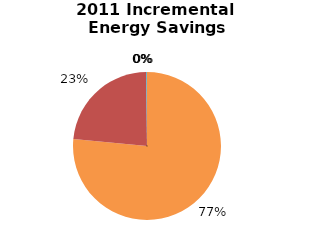
| Category | Incremental Energy Savings (kWh) |
|---|---|
| Consumer Program Total | 81973.659 |
| Business Program Total | 24976.776 |
| Industrial Program Total | 0 |
| Home Assistance Program Total | 0 |
| Pre-2011 Programs completed in 2011 Total | 182.198 |